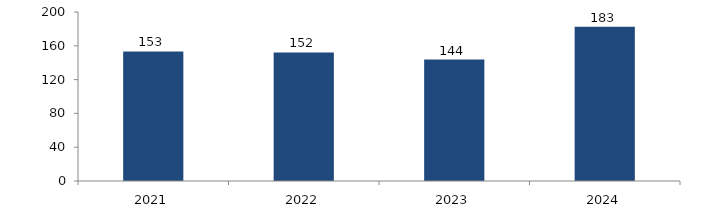
| Category | Bogotá |
|---|---|
| 2021.0 | 153.277 |
| 2022.0 | 152.08 |
| 2023.0 | 143.784 |
| 2024.0 | 182.528 |